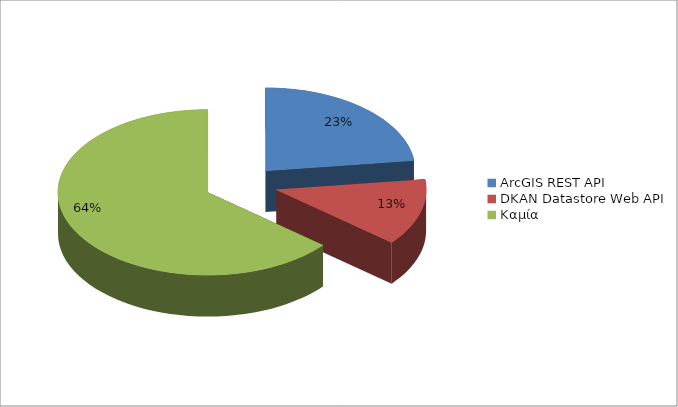
| Category | Παροχή Υπηρεσίας (API) |
|---|---|
| ArcGIS REST API | 46 |
| DKAN Datastore Web API | 26 |
| Καμία | 128 |